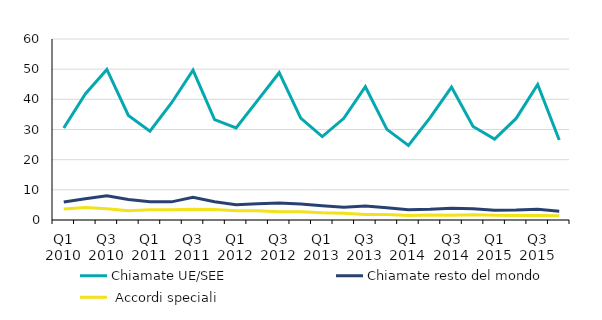
| Category | Chiamate UE/SEE | Chiamate resto del mondo  |  Accordi speciali  |
|---|---|---|---|
| Q1 2010 | 30.508 | 5.951 | 3.611 |
| Q2 2010 | 41.764 | 7.028 | 4.125 |
| Q3 2010 | 49.907 | 8.028 | 3.718 |
| Q4 2010 | 34.666 | 6.797 | 3.031 |
| Q1 2011 | 29.452 | 6.02 | 3.42 |
| Q2 2011 | 38.792 | 6.01 | 3.424 |
| Q3 2011 | 49.654 | 7.503 | 3.53 |
| Q4 2011 | 33.3 | 6.034 | 3.452 |
| Q1 2012 | 30.526 | 5.093 | 3.073 |
| Q2 2012 | 39.654 | 5.384 | 3.058 |
| Q3 2012 | 48.827 | 5.662 | 2.697 |
| Q4 2012 | 33.799 | 5.329 | 2.717 |
| Q1 2013 | 27.65 | 4.721 | 2.378 |
| Q2 2013 | 33.711 | 4.208 | 2.245 |
| Q3 2013 | 44.187 | 4.659 | 1.822 |
| Q4 2013 | 30.051 | 4.056 | 1.796 |
| Q1 2014 | 24.693 | 3.419 | 1.529 |
| Q2 2014 | 33.838 | 3.536 | 1.646 |
| Q3 2014 | 44.076 | 3.854 | 1.569 |
| Q4 2014 | 31.02 | 3.743 | 1.768 |
| Q1 2015 | 26.84 | 3.245 | 1.561 |
| Q2 2015 | 33.673 | 3.292 | 1.522 |
| Q3 2015 | 44.932 | 3.601 | 1.485 |
| Q4 2015 | 26.527 | 2.913 | 1.443 |